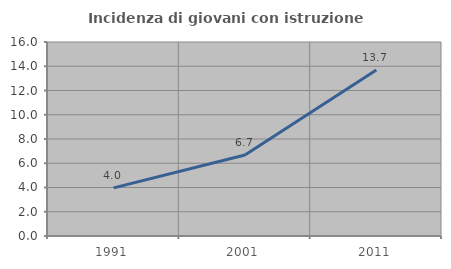
| Category | Incidenza di giovani con istruzione universitaria |
|---|---|
| 1991.0 | 3.968 |
| 2001.0 | 6.682 |
| 2011.0 | 13.69 |